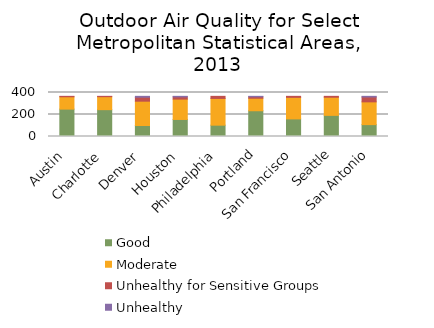
| Category | Good | Moderate | Unhealthy for Sensitive Groups | Unhealthy   |
|---|---|---|---|---|
| Austin | 249 | 112 | 4 | 0 |
| Charlotte | 244 | 118 | 3 | 0 |
| Denver | 100 | 221 | 36 | 8 |
| Houston | 155 | 185 | 20 | 5 |
| Philadelphia | 103 | 243 | 19 | 0 |
| Portland | 234 | 114 | 13 | 4 |
| San Francisco | 160 | 196 | 9 | 0 |
| Seattle | 192 | 165 | 8 | 0 |
| San Antonio | 108 | 207 | 44 | 6 |